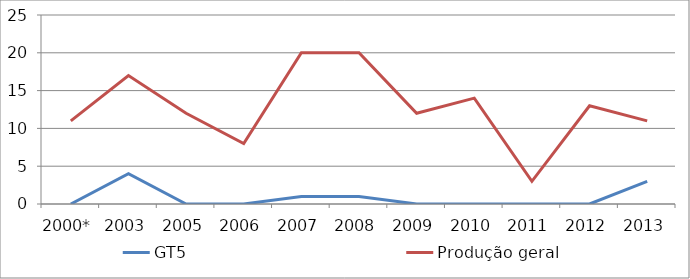
| Category | GT5 | Produção geral |
|---|---|---|
| 2000* | 0 | 11 |
| 2003 | 4 | 17 |
| 2005 | 0 | 12 |
| 2006 | 0 | 8 |
| 2007 | 1 | 20 |
| 2008 | 1 | 20 |
| 2009 | 0 | 12 |
| 2010 | 0 | 14 |
| 2011 | 0 | 3 |
| 2012 | 0 | 13 |
| 2013 | 3 | 11 |